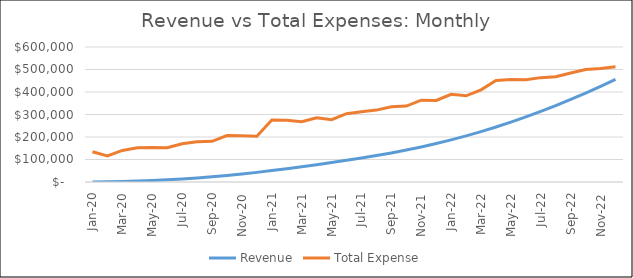
| Category | Revenue | Total Expense |
|---|---|---|
| 2020-01-01 | 0 | 134557.5 |
| 2020-02-29 | 825 | 115657.5 |
| 2020-03-31 | 2245.161 | 140384.375 |
| 2020-04-30 | 4325.227 | 152005.375 |
| 2020-05-31 | 6706.522 | 153293.475 |
| 2020-06-30 | 9754.12 | 151939.885 |
| 2020-07-31 | 13516.23 | 170090.936 |
| 2020-08-31 | 17619.239 | 178372.467 |
| 2020-09-30 | 22827.264 | 180567.339 |
| 2020-10-31 | 28937.746 | 206496.073 |
| 2020-11-30 | 35554.703 | 205131.867 |
| 2020-12-31 | 42805.408 | 202991.242 |
| 2021-01-31 | 50619.405 | 275451.778 |
| 2021-02-28 | 58947.391 | 274006.246 |
| 2021-03-31 | 67555.785 | 267900.23 |
| 2021-04-30 | 76779.082 | 285779.979 |
| 2021-05-31 | 86308.361 | 276816.354 |
| 2021-06-30 | 96250.484 | 303701.477 |
| 2021-07-31 | 106836.454 | 312706.624 |
| 2021-08-31 | 117608.978 | 319583.497 |
| 2021-09-30 | 129312.726 | 334235.712 |
| 2021-10-31 | 142058.363 | 337397.894 |
| 2021-11-30 | 155937.637 | 363436.669 |
| 2021-12-31 | 171025.134 | 362250.696 |
| 2022-01-31 | 187379.902 | 389712.151 |
| 2022-02-28 | 205046.942 | 382919.593 |
| 2022-03-31 | 224058.586 | 409681.814 |
| 2022-04-30 | 244435.768 | 451093.632 |
| 2022-05-31 | 266189.189 | 455231.506 |
| 2022-06-30 | 289320.398 | 454133.374 |
| 2022-07-31 | 313822.779 | 463867.996 |
| 2022-08-31 | 339682.461 | 467761.249 |
| 2022-09-30 | 366879.154 | 484471.902 |
| 2022-10-31 | 395386.918 | 499693.279 |
| 2022-11-30 | 425174.867 | 504282.757 |
| 2022-12-31 | 456207.812 | 511837.524 |